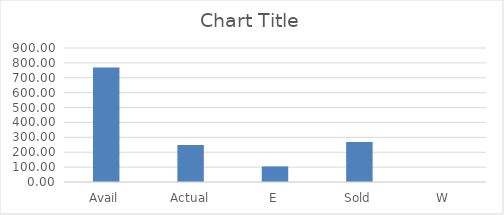
| Category | Series 0 |
|---|---|
| Avail | 769.2 |
| Actual | 247.82 |
| E | 104.68 |
| Sold | 268.9 |
| W | 0 |